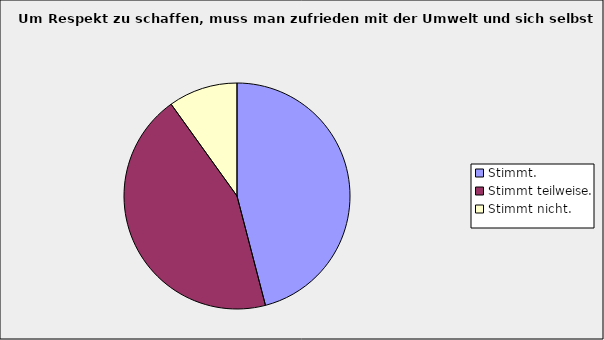
| Category | Series 0 |
|---|---|
| Stimmt. | 0.459 |
| Stimmt teilweise. | 0.441 |
| Stimmt nicht. | 0.099 |